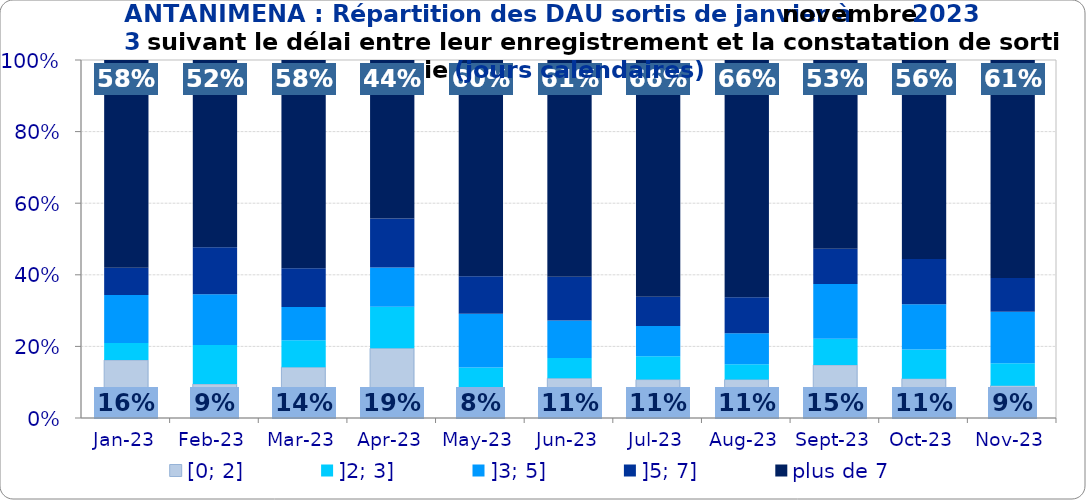
| Category | [0; 2] | ]2; 3] | ]3; 5] | ]5; 7] | plus de 7 |
|---|---|---|---|---|---|
| 2023-01-01 | 0.162 | 0.048 | 0.134 | 0.076 | 0.58 |
| 2023-02-01 | 0.095 | 0.109 | 0.142 | 0.131 | 0.523 |
| 2023-03-01 | 0.142 | 0.075 | 0.093 | 0.109 | 0.581 |
| 2023-04-01 | 0.195 | 0.116 | 0.109 | 0.137 | 0.442 |
| 2023-05-01 | 0.081 | 0.06 | 0.15 | 0.105 | 0.604 |
| 2023-06-01 | 0.111 | 0.057 | 0.104 | 0.123 | 0.605 |
| 2023-07-01 | 0.107 | 0.065 | 0.084 | 0.082 | 0.661 |
| 2023-08-01 | 0.107 | 0.042 | 0.087 | 0.101 | 0.662 |
| 2023-09-01 | 0.148 | 0.073 | 0.153 | 0.098 | 0.527 |
| 2023-10-01 | 0.11 | 0.081 | 0.127 | 0.126 | 0.556 |
| 2023-11-01 | 0.09 | 0.063 | 0.144 | 0.095 | 0.609 |